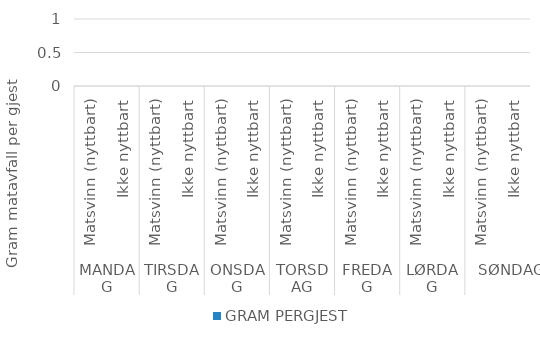
| Category |  GRAM PERGJEST  |
|---|---|
| 0 | 0 |
| 1 | 0 |
| 2 | 0 |
| 3 | 0 |
| 4 | 0 |
| 5 | 0 |
| 6 | 0 |
| 7 | 0 |
| 8 | 0 |
| 9 | 0 |
| 10 | 0 |
| 11 | 0 |
| 12 | 0 |
| 13 | 0 |